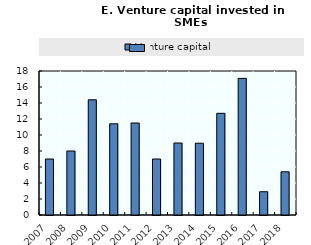
| Category | Venture capital |
|---|---|
| 2007.0 | 7 |
| 2008.0 | 8 |
| 2009.0 | 14.4 |
| 2010.0 | 11.4 |
| 2011.0 | 11.5 |
| 2012.0 | 7 |
| 2013.0 | 9 |
| 2014.0 | 8.97 |
| 2015.0 | 12.71 |
| 2016.0 | 17.08 |
| 2017.0 | 2.91 |
| 2018.0 | 5.4 |